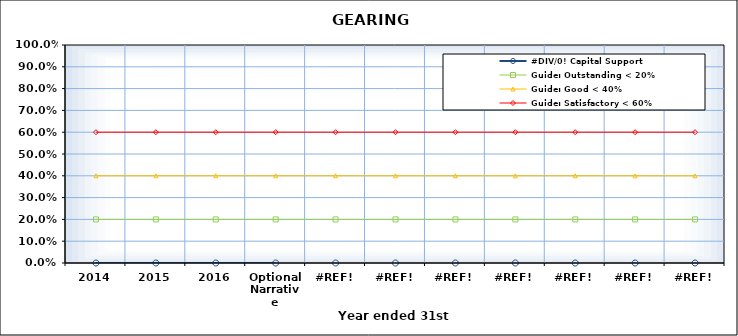
| Category | #DIV/0! Capital Support | Guide: Outstanding < 20% | Guide: Good < 40% | Guide: Satisfactory < 60% |
|---|---|---|---|---|
| 2014 |  | 0.2 | 0.4 | 0.6 |
| 2015 |  | 0.2 | 0.4 | 0.6 |
| 2016 |  | 0.2 | 0.4 | 0.6 |
| Optional Narrative |  | 0.2 | 0.4 | 0.6 |
| #REF! |  | 0.2 | 0.4 | 0.6 |
| #REF! |  | 0.2 | 0.4 | 0.6 |
| #REF! |  | 0.2 | 0.4 | 0.6 |
| #REF! |  | 0.2 | 0.4 | 0.6 |
| #REF! |  | 0.2 | 0.4 | 0.6 |
| #REF! |  | 0.2 | 0.4 | 0.6 |
| #REF! |  | 0.2 | 0.4 | 0.6 |